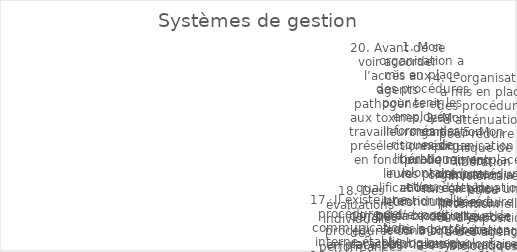
| Category | Series 0 |
|---|---|
| 1. Mon organisation a mis en place des procédures pour tenir les employés informés des risques de libération involontaire et/ou intentionnelle ou d’exposition à des agents biologiques et/ou à des toxines qui sont stockés ou manipulés dans nos installation | 5 |
| 2. Mon organisation explique publiquement les procédures et les règles de conduite liées à la biosécurité et à la biosûreté lors de l’orientation des nouveaux employés. | 3 |
| 3. Mon organisation a mis en place un processus d’analyse des risques-avantages systématique pour la recherche à double usage. | 1 |
| 4. L’organisation a mis en place des procédures d’atténuation pour réduire le risque de libération involontaire et/ou intentionnelle ou d’exposition à des agents biologiques et/ou des toxines stockés ou manipulés dans mon installation. | 1 |
| 5. Mon organisation a mis en place des procédures d’atténuation pour réduire le risque de libération involontaire et/ou intentionnelle ou d’exposition à des agents biologiques et/ou à des toxines stockés ou manipulés dans nos installations. | 3 |
| 6. Mon organisation a mis en place des procédures qui détaillent les actions requises lors d’un incident. | 4 |
| 7. Les leçons tirées des exercices d’urgence ont amélioré les performances organisationnelles. | 4 |
| 8. Mon organisation organise régulièrement des exercices d’intervention d’urgence. | 1 |
| 9. Il existe une liste à jour du personnel ayant un accès autorisé aux agents biologiques. | 1 |
| 10. L’utilisation des enseignements tirés des exercices d’urgence a amélioré les performances organisationnelles. | 5 |
| 11. Il existe une procédure permettant aux employés de signaler un comportement inhabituel à l’égard d’un collègue. | 0 |
| 12. L’utilisation des enseignements tirés des violations de la biosécurité/biosûreté ou des quasi-accidents a amélioré les performances organisationnelles. | 1 |
| 13. Il existe une liste disponible et à jour du personnel autorisé à accéder aux agents biologiques. | 0 |
| 14.  L’organisation a une formation continue en matière de biosécurité et de biosûreté et une formation axée sur les compétences pour les employés. | 4 |
| 15. Les informations concernant les mesures, procédures et politiques de biosécurité et de biosûreté sont facilement accessibles aux employés. | 2 |
| 16. Il existe une procédure permettant aux employés de signaler le comportement inhabituel d’un collègue. | 4 |
| 17. Il existe une procédure de communication interne établie pour informer les employés des incidents de biosécurité et de biosûreté et des quasi-accidents. | 0 |
| 18. Des évaluations individuelles des performances en matière de biosécurité/biosûreté ont lieu régulièrement. | 2 |
| 19. Des procédures sont en place pour la décontamination et la gestion des déchets. | 2 |
| 20. Avant de se voir accorder l’accès aux agents pathogènes et aux toxines, les travailleurs sont présélectionnés en fonction de leurs qualifications, leurs compétences et leurs caractéristiques personnelles appropriées pour le poste, et ainsi ils sont dé | 4 |